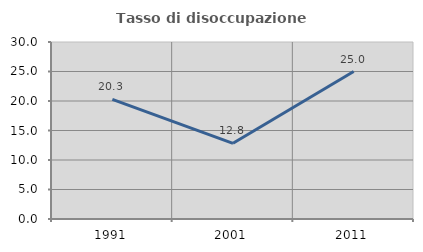
| Category | Tasso di disoccupazione giovanile  |
|---|---|
| 1991.0 | 20.27 |
| 2001.0 | 12.832 |
| 2011.0 | 25 |